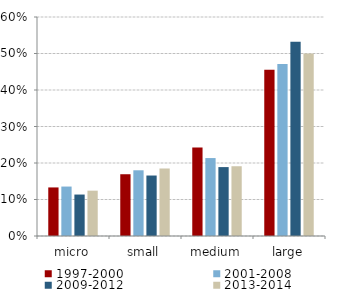
| Category | 1997-2000 | 2001-2008 | 2009-2012 | 2013-2014 |
|---|---|---|---|---|
| micro | 0.133 | 0.135 | 0.114 | 0.124 |
| small | 0.169 | 0.18 | 0.166 | 0.185 |
| medium | 0.242 | 0.214 | 0.189 | 0.191 |
| large | 0.455 | 0.471 | 0.532 | 0.5 |